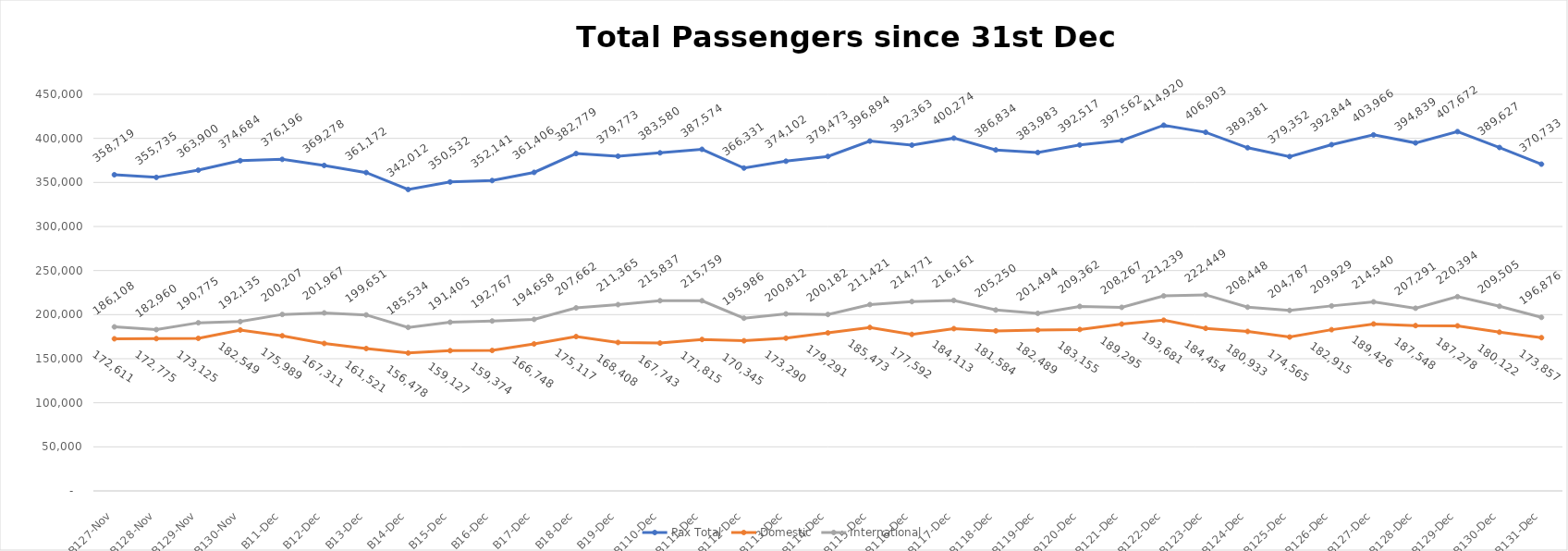
| Category | Pax Total |  Domestic  |  International  |
|---|---|---|---|
| 2023-11-27 | 358719 | 172611 | 186108 |
| 2023-11-28 | 355735 | 172775 | 182960 |
| 2023-11-29 | 363900 | 173125 | 190775 |
| 2023-11-30 | 374684 | 182549 | 192135 |
| 2023-12-01 | 376196 | 175989 | 200207 |
| 2023-12-02 | 369278 | 167311 | 201967 |
| 2023-12-03 | 361172 | 161521 | 199651 |
| 2023-12-04 | 342012 | 156478 | 185534 |
| 2023-12-05 | 350532 | 159127 | 191405 |
| 2023-12-06 | 352141 | 159374 | 192767 |
| 2023-12-07 | 361406 | 166748 | 194658 |
| 2023-12-08 | 382779 | 175117 | 207662 |
| 2023-12-09 | 379773 | 168408 | 211365 |
| 2023-12-10 | 383580 | 167743 | 215837 |
| 2023-12-11 | 387574 | 171815 | 215759 |
| 2023-12-12 | 366331 | 170345 | 195986 |
| 2023-12-13 | 374102 | 173290 | 200812 |
| 2023-12-14 | 379473 | 179291 | 200182 |
| 2023-12-15 | 396894 | 185473 | 211421 |
| 2023-12-16 | 392363 | 177592 | 214771 |
| 2023-12-17 | 400274 | 184113 | 216161 |
| 2023-12-18 | 386834 | 181584 | 205250 |
| 2023-12-19 | 383983 | 182489 | 201494 |
| 2023-12-20 | 392517 | 183155 | 209362 |
| 2023-12-21 | 397562 | 189295 | 208267 |
| 2023-12-22 | 414920 | 193681 | 221239 |
| 2023-12-23 | 406903 | 184454 | 222449 |
| 2023-12-24 | 389381 | 180933 | 208448 |
| 2023-12-25 | 379352 | 174565 | 204787 |
| 2023-12-26 | 392844 | 182915 | 209929 |
| 2023-12-27 | 403966 | 189426 | 214540 |
| 2023-12-28 | 394839 | 187548 | 207291 |
| 2023-12-29 | 407672 | 187278 | 220394 |
| 2023-12-30 | 389627 | 180122 | 209505 |
| 2023-12-31 | 370733 | 173857 | 196876 |